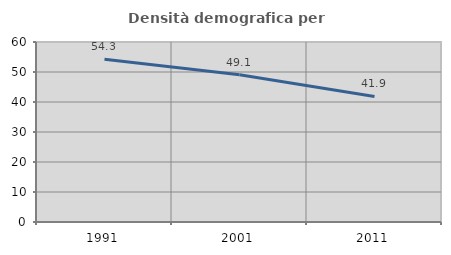
| Category | Densità demografica |
|---|---|
| 1991.0 | 54.251 |
| 2001.0 | 49.057 |
| 2011.0 | 41.862 |